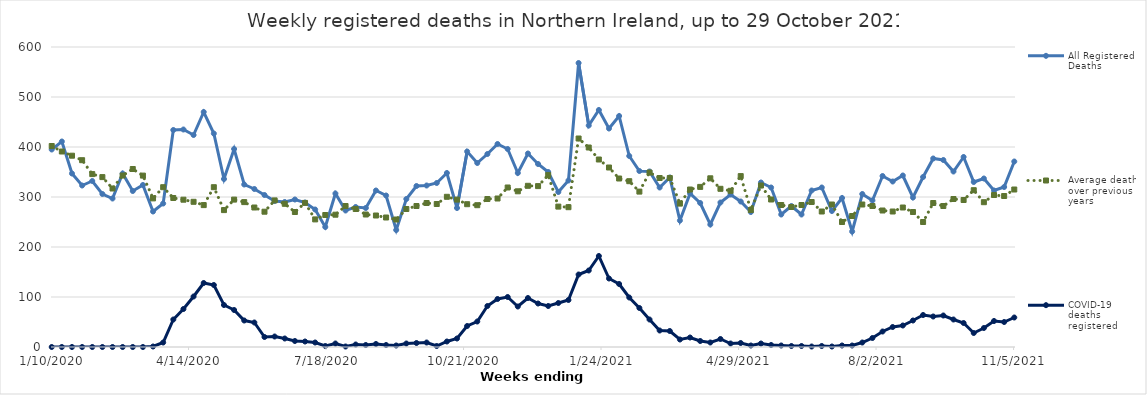
| Category | All Registered Deaths | Average deaths over previous 5 years | COVID-19 deaths registered |
|---|---|---|---|
| 1/10/20 | 395 | 402 | 0 |
| 1/17/20 | 411 | 391 | 0 |
| 1/24/20 | 347 | 382.6 | 0 |
| 1/31/20 | 323 | 373.6 | 0 |
| 2/7/20 | 332 | 345.8 | 0 |
| 2/14/20 | 306 | 339.8 | 0 |
| 2/21/20 | 297 | 317 | 0 |
| 2/28/20 | 347 | 343 | 0 |
| 3/6/20 | 312 | 356 | 0 |
| 3/13/20 | 324 | 342.8 | 0 |
| 3/20/20 | 271 | 297.2 | 1 |
| 3/27/20 | 287 | 319.6 | 9 |
| 4/3/20 | 434 | 298 | 55 |
| 4/10/20 | 435 | 294.6 | 76 |
| 4/17/20 | 424 | 290.4 | 101 |
| 4/24/20 | 470 | 283.8 | 128 |
| 5/1/20 | 427 | 319.6 | 124 |
| 5/8/20 | 336 | 273.8 | 84 |
| 5/15/20 | 396 | 294.8 | 74 |
| 5/22/20 | 325 | 289.8 | 53 |
| 5/29/20 | 316 | 279 | 49 |
| 6/5/20 | 304 | 270.6 | 20 |
| 6/12/20 | 292 | 293.2 | 21 |
| 6/19/20 | 290 | 286.4 | 17 |
| 6/26/20 | 295 | 270 | 12 |
| 7/3/20 | 289 | 288.2 | 11 |
| 7/10/20 | 275 | 255.2 | 9 |
| 7/17/20 | 240 | 264 | 2 |
| 7/24/20 | 307 | 264.6 | 7 |
| 7/31/20 | 273 | 282 | 1 |
| 8/7/20 | 280 | 276 | 5 |
| 8/14/20 | 278 | 265 | 4 |
| 8/21/20 | 313 | 263 | 6 |
| 8/28/20 | 303 | 259 | 4 |
| 9/4/20 | 234 | 255 | 3 |
| 9/11/20 | 296 | 276 | 7 |
| 9/18/20 | 322 | 282 | 8 |
| 9/25/20 | 323 | 288 | 9 |
| 10/2/20 | 328 | 286 | 2 |
| 10/9/20 | 348 | 300.4 | 11 |
| 10/16/20 | 278 | 294.8 | 17 |
| 10/23/20 | 391 | 285.6 | 42 |
| 10/30/20 | 368 | 283.6 | 51 |
| 11/6/20 | 386 | 296 | 82 |
| 11/13/20 | 406 | 297 | 96 |
| 11/20/20 | 396 | 319 | 100 |
| 11/27/20 | 348 | 311.4 | 81 |
| 12/4/20 | 387 | 322.4 | 98 |
| 12/11/20 | 366 | 321.8 | 87 |
| 12/18/20 | 350 | 343.8 | 82 |
| 12/25/20 | 310 | 280.8 | 88 |
| 1/1/21 | 333 | 279.6 | 94 |
| 1/8/21 | 568 | 417 | 145 |
| 1/15/21 | 443 | 399 | 153 |
| 1/22/21 | 474 | 375 | 182 |
| 1/29/21 | 437 | 359 | 137 |
| 2/5/21 | 462 | 337 | 126 |
| 2/12/21 | 382 | 331.6 | 99 |
| 2/19/21 | 352 | 310.8 | 78 |
| 2/26/21 | 351 | 349 | 55 |
| 3/5/21 | 319 | 338 | 33 |
| 3/12/21 | 339 | 338 | 32 |
| 3/19/21 | 253 | 286.8 | 15 |
| 3/26/21 | 307 | 315 | 19 |
| 4/2/21 | 288 | 320.2 | 12 |
| 4/9/21 | 245 | 337.4 | 9 |
| 4/16/21 | 289 | 316.4 | 16 |
| 4/23/21 | 305 | 312.4 | 7 |
| 4/30/21 | 291 | 341.8 | 8 |
| 5/7/21 | 270 | 274 | 3 |
| 5/14/21 | 329 | 323 | 7 |
| 5/21/21 | 319 | 295 | 4 |
| 5/28/21 | 265 | 284 | 3 |
| 6/4/21 | 282 | 280 | 2 |
| 6/11/21 | 265 | 284 | 2 |
| 6/18/21 | 313 | 290 | 1 |
| 6/25/21 | 319 | 271 | 2 |
| 7/2/21 | 272 | 285 | 1 |
| 7/9/21 | 298 | 250 | 3 |
| 7/16/21 | 231 | 262 | 3 |
| 7/23/21 | 306 | 285 | 9 |
| 7/30/21 | 293 | 282 | 18 |
| 8/6/21 | 342 | 273 | 31 |
| 8/13/21 | 331 | 271 | 40 |
| 8/20/21 | 343 | 279 | 43 |
| 8/27/21 | 299 | 270 | 53 |
| 9/3/21 | 340 | 250 | 64 |
| 9/10/21 | 377 | 288 | 61 |
| 9/17/21 | 374 | 282 | 63 |
| 9/24/21 | 351 | 296 | 55 |
| 10/1/21 | 380 | 294 | 48 |
| 10/8/21 | 330 | 313.6 | 28 |
| 10/15/21 | 337 | 289.6 | 38 |
| 10/22/21 | 313 | 304 | 52 |
| 10/29/21 | 320 | 302 | 50 |
| 11/5/21 | 371 | 315 | 59 |